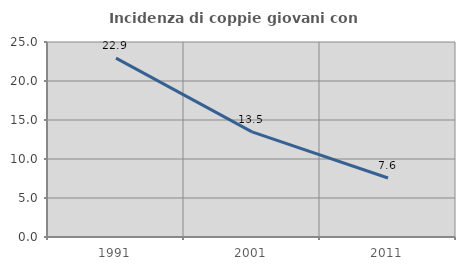
| Category | Incidenza di coppie giovani con figli |
|---|---|
| 1991.0 | 22.935 |
| 2001.0 | 13.478 |
| 2011.0 | 7.561 |